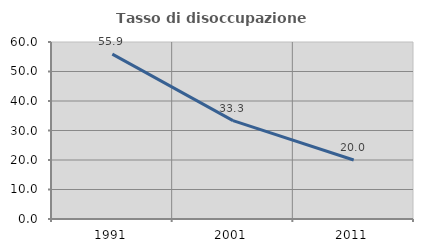
| Category | Tasso di disoccupazione giovanile  |
|---|---|
| 1991.0 | 55.882 |
| 2001.0 | 33.333 |
| 2011.0 | 20 |